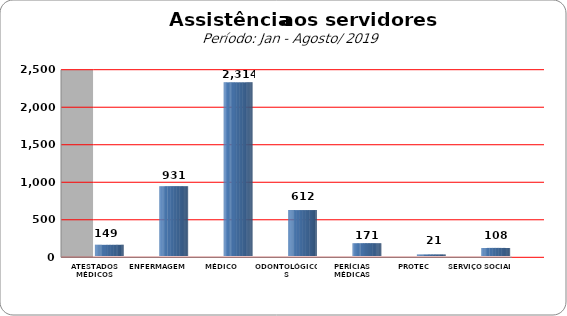
| Category | Series 0 |
|---|---|
| ATESTADOS MÉDICOS | 149 |
| ENFERMAGEM | 931 |
| MÉDICO | 2314 |
| ODONTOLÓGICOS | 612 |
| PERÍCIAS MÉDICAS | 171 |
| PROTEC | 21 |
| SERVIÇO SOCIAL | 108 |